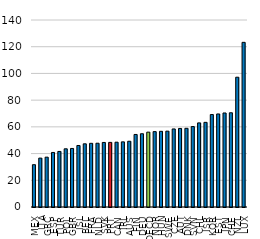
| Category | Series 0 |
|---|---|
| MEX | 31.672 |
| ITA | 36.606 |
| GRC | 37.31 |
| ESP | 40.826 |
| TUR | 41.593 |
| POL | 43.572 |
| GBR | 43.822 |
| ISL | 46.054 |
| BEL | 47.3 |
| FRA | 47.674 |
| NLD | 47.744 |
| SVK | 48.318 |
| PRT | 48.38 |
| CAN | 48.523 |
| IRL | 48.766 |
| AUS | 49.222 |
| FIN | 54.304 |
| DEU | 54.842 |
| OECD | 56.041 |
| NOR | 56.429 |
| HUN | 56.663 |
| SWE | 56.784 |
| CZE | 58.439 |
| AUT | 58.8 |
| DNK | 58.905 |
| SVN | 60.224 |
| CHL | 62.968 |
| ISR | 63.372 |
| KOR | 69.207 |
| EST | 69.657 |
| JPN | 70.387 |
| CHE | 70.544 |
| NZL | 97.17 |
| LUX | 123.263 |